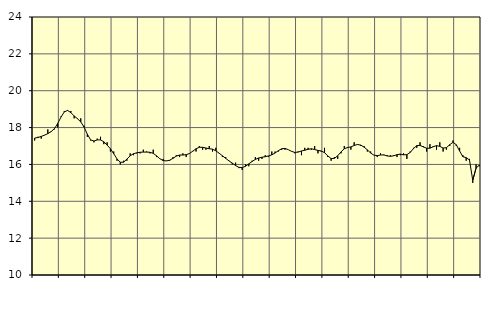
| Category | Piggar | Handel, SNI 45-47 |
|---|---|---|
| nan | 17.3 | 17.43 |
| 87.0 | 17.5 | 17.46 |
| 87.0 | 17.4 | 17.52 |
| 87.0 | 17.6 | 17.59 |
| nan | 17.9 | 17.67 |
| 88.0 | 17.8 | 17.78 |
| 88.0 | 17.9 | 17.94 |
| 88.0 | 18 | 18.22 |
| nan | 18.6 | 18.57 |
| 89.0 | 18.9 | 18.85 |
| 89.0 | 18.9 | 18.93 |
| 89.0 | 18.9 | 18.81 |
| nan | 18.5 | 18.63 |
| 90.0 | 18.5 | 18.48 |
| 90.0 | 18.5 | 18.31 |
| 90.0 | 18.1 | 18.03 |
| nan | 17.5 | 17.64 |
| 91.0 | 17.3 | 17.33 |
| 91.0 | 17.2 | 17.27 |
| 91.0 | 17.4 | 17.33 |
| nan | 17.5 | 17.33 |
| 92.0 | 17.1 | 17.23 |
| 92.0 | 17.2 | 17.05 |
| 92.0 | 16.7 | 16.85 |
| nan | 16.7 | 16.58 |
| 93.0 | 16.2 | 16.3 |
| 93.0 | 16 | 16.12 |
| 93.0 | 16.2 | 16.12 |
| nan | 16.2 | 16.29 |
| 94.0 | 16.6 | 16.47 |
| 94.0 | 16.5 | 16.58 |
| 94.0 | 16.6 | 16.63 |
| nan | 16.6 | 16.66 |
| 95.0 | 16.8 | 16.67 |
| 95.0 | 16.7 | 16.67 |
| 95.0 | 16.6 | 16.66 |
| nan | 16.8 | 16.6 |
| 96.0 | 16.4 | 16.47 |
| 96.0 | 16.3 | 16.31 |
| 96.0 | 16.3 | 16.21 |
| nan | 16.2 | 16.19 |
| 97.0 | 16.2 | 16.23 |
| 97.0 | 16.4 | 16.33 |
| 97.0 | 16.5 | 16.45 |
| nan | 16.4 | 16.51 |
| 98.0 | 16.6 | 16.51 |
| 98.0 | 16.4 | 16.53 |
| 98.0 | 16.6 | 16.59 |
| nan | 16.7 | 16.72 |
| 99.0 | 16.7 | 16.85 |
| 99.0 | 17 | 16.93 |
| 99.0 | 16.8 | 16.93 |
| nan | 16.8 | 16.89 |
| 0.0 | 17 | 16.85 |
| 0.0 | 16.7 | 16.83 |
| 0.0 | 16.9 | 16.74 |
| nan | 16.6 | 16.61 |
| 1.0 | 16.4 | 16.47 |
| 1.0 | 16.4 | 16.33 |
| 1.0 | 16.2 | 16.19 |
| nan | 16 | 16.07 |
| 2.0 | 16.1 | 15.94 |
| 2.0 | 15.8 | 15.84 |
| 2.0 | 15.7 | 15.83 |
| nan | 16 | 15.9 |
| 3.0 | 15.9 | 16.03 |
| 3.0 | 16.2 | 16.16 |
| 3.0 | 16.4 | 16.27 |
| nan | 16.2 | 16.35 |
| 4.0 | 16.3 | 16.39 |
| 4.0 | 16.5 | 16.42 |
| 4.0 | 16.4 | 16.46 |
| nan | 16.7 | 16.52 |
| 5.0 | 16.7 | 16.62 |
| 5.0 | 16.7 | 16.75 |
| 5.0 | 16.8 | 16.85 |
| nan | 16.8 | 16.87 |
| 6.0 | 16.8 | 16.8 |
| 6.0 | 16.7 | 16.71 |
| 6.0 | 16.6 | 16.65 |
| nan | 16.7 | 16.67 |
| 7.0 | 16.5 | 16.73 |
| 7.0 | 16.9 | 16.77 |
| 7.0 | 16.9 | 16.82 |
| nan | 16.8 | 16.85 |
| 8.0 | 17 | 16.81 |
| 8.0 | 16.6 | 16.76 |
| 8.0 | 16.7 | 16.73 |
| nan | 16.9 | 16.64 |
| 9.0 | 16.4 | 16.46 |
| 9.0 | 16.2 | 16.32 |
| 9.0 | 16.4 | 16.33 |
| nan | 16.3 | 16.47 |
| 10.0 | 16.6 | 16.68 |
| 10.0 | 17 | 16.85 |
| 10.0 | 16.9 | 16.92 |
| nan | 16.8 | 16.95 |
| 11.0 | 17.2 | 17.03 |
| 11.0 | 17.1 | 17.08 |
| 11.0 | 17 | 17.05 |
| nan | 17 | 16.94 |
| 12.0 | 16.7 | 16.79 |
| 12.0 | 16.7 | 16.62 |
| 12.0 | 16.5 | 16.5 |
| nan | 16.4 | 16.48 |
| 13.0 | 16.6 | 16.51 |
| 13.0 | 16.5 | 16.52 |
| 13.0 | 16.5 | 16.46 |
| nan | 16.5 | 16.44 |
| 14.0 | 16.5 | 16.47 |
| 14.0 | 16.4 | 16.53 |
| 14.0 | 16.5 | 16.56 |
| nan | 16.6 | 16.52 |
| 15.0 | 16.3 | 16.53 |
| 15.0 | 16.7 | 16.65 |
| 15.0 | 16.9 | 16.86 |
| nan | 16.9 | 17.02 |
| 16.0 | 17.2 | 17.03 |
| 16.0 | 17 | 16.95 |
| 16.0 | 16.7 | 16.88 |
| nan | 17.1 | 16.88 |
| 17.0 | 17 | 16.96 |
| 17.0 | 16.8 | 17.02 |
| 17.0 | 17.2 | 16.98 |
| nan | 16.7 | 16.89 |
| 18.0 | 16.8 | 16.91 |
| 18.0 | 17 | 17.07 |
| 18.0 | 17.3 | 17.2 |
| nan | 17 | 17.07 |
| 19.0 | 16.9 | 16.73 |
| 19.0 | 16.5 | 16.42 |
| 19.0 | 16.2 | 16.37 |
| nan | 16.3 | 16.24 |
| 20.0 | 15 | 15.14 |
| 20.0 | 16 | 15.8 |
| 20.0 | 15.9 | 15.97 |